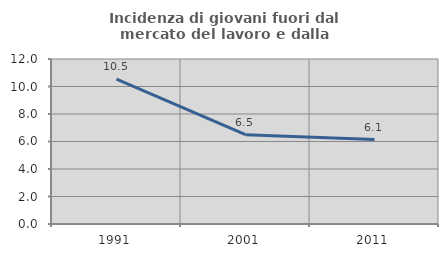
| Category | Incidenza di giovani fuori dal mercato del lavoro e dalla formazione  |
|---|---|
| 1991.0 | 10.536 |
| 2001.0 | 6.497 |
| 2011.0 | 6.145 |